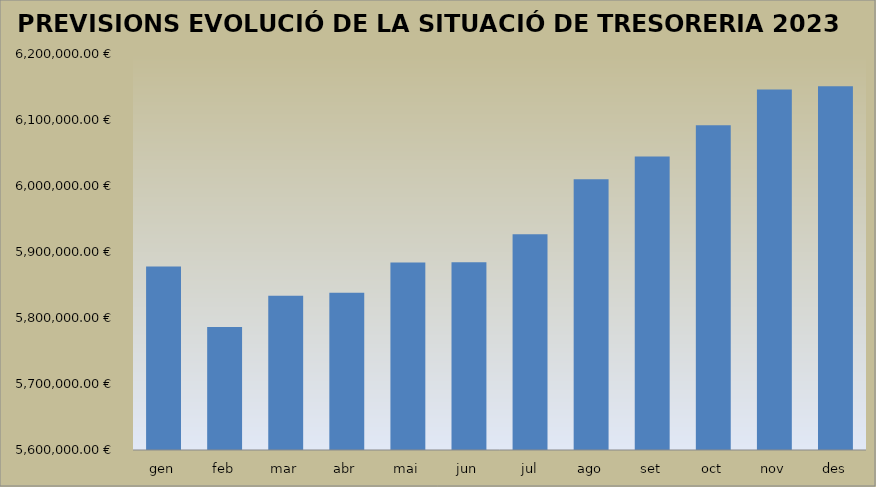
| Category | PREVISIÓ RESUM ANUAL TRESORERIA 2023 |
|---|---|
| gen | 5878070.21 |
| feb | 5786294.73 |
| mar | 5833644.01 |
| abr | 5838100.43 |
| mai | 5884210.96 |
| jun | 5884490.21 |
| jul | 5926817.7 |
| ago | 6010202.1 |
| set | 6044830.01 |
| oct | 6092019.98 |
| nov | 6146124.8 |
| des | 6150975.19 |